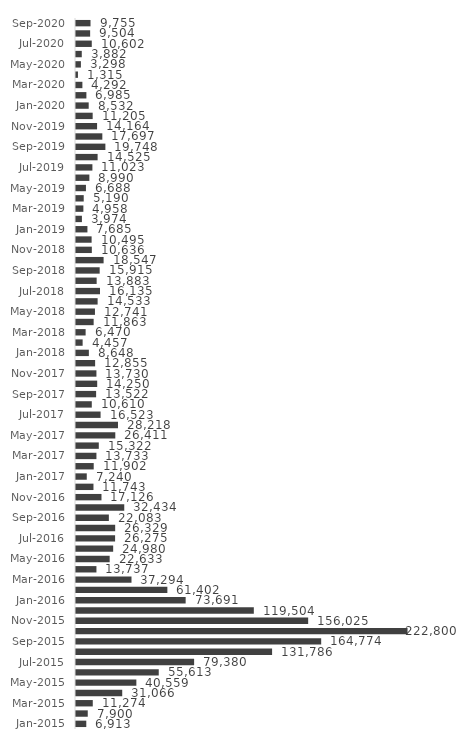
| Category | Series 0 |
|---|---|
| Jan-2015 | 6913 |
| Feb-2015 | 7900 |
| Mar-2015 | 11274 |
| Apr-2015 | 31066 |
| May-2015 | 40559 |
| Jun-2015 | 55613 |
| Jul-2015 | 79380 |
| Aug-2015 | 131786 |
| Sep-2015 | 164774 |
| Oct-2015 | 222800 |
| Nov-2015 | 156025 |
| Dec-2015 | 119504 |
| Jan-2016 | 73691 |
| Feb-2016 | 61402 |
| Mar-2016 | 37294 |
| Apr-2016 | 13737 |
| May-2016 | 22633 |
| Jun-2016 | 24980 |
| Jul-2016 | 26275 |
| Aug-2016 | 26329 |
| Sep-2016 | 22083 |
| Oct-2016 | 32434 |
| Nov-2016 | 17126 |
| Dec-2016 | 11743 |
| Jan-2017 | 7240 |
| Feb-2017 | 11902 |
| Mar-2017 | 13733 |
| Apr-2017 | 15322 |
| May-2017 | 26411 |
| Jun-2017 | 28218 |
| Jul-2017 | 16523 |
| Aug-2017 | 10610 |
| Sep-2017 | 13522 |
| Oct-2017 | 14250 |
| Nov-2017 | 13730 |
| Dec-2017 | 12855 |
| Jan-2018 | 8648 |
| Feb-2018 | 4457 |
| Mar-2018 | 6470 |
| Apr-2018 | 11863 |
| May-2018 | 12741 |
| Jun-2018 | 14533 |
| Jul-2018 | 16135 |
| Aug-2018 | 13883 |
| Sep-2018 | 15915 |
| Oct-2018 | 18547 |
| Nov-2018 | 10636 |
| Dec-2018 | 10495 |
| Jan-2019 | 7685 |
| Feb-2019 | 3974 |
| Mar-2019 | 4958 |
| Apr-2019 | 5190 |
| May-2019 | 6688 |
| Jun-2019 | 8990 |
| Jul-2019 | 11023 |
| Aug-2019 | 14525 |
| Sep-2019 | 19748 |
| Oct-2019 | 17697 |
| Nov-2019 | 14164 |
| Dec-2019 | 11205 |
| Jan-2020 | 8532 |
| Feb-2020 | 6985 |
| Mar-2020 | 4292 |
| Apr-2020 | 1315 |
| May-2020 | 3298 |
| Jun-2020 | 3882 |
| Jul-2020 | 10602 |
| Aug-2020 | 9504 |
| Sep-2020 | 9755 |